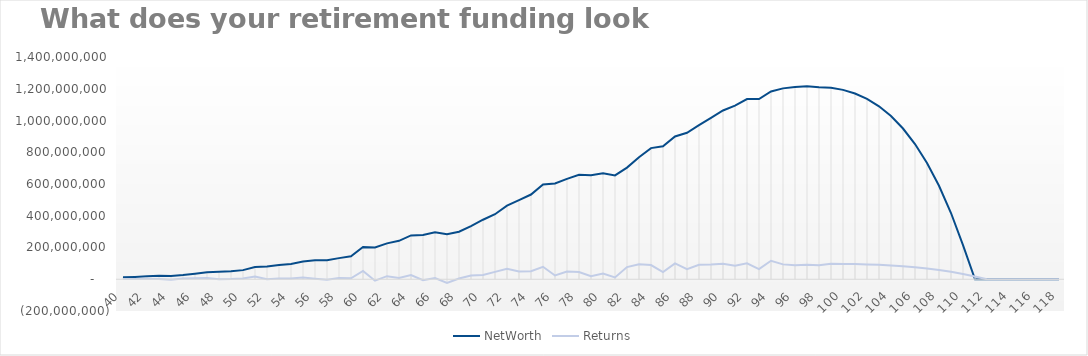
| Category | NetWorth | Returns |
|---|---|---|
| 40.0 | 12292444.778 | 1292444.778 |
| 41.0 | 14690159.456 | 1300964.678 |
| 42.0 | 18507638.558 | 2615334.101 |
| 43.0 | 21353087.016 | 1528527.234 |
| 44.0 | 19764624.223 | -3030338.404 |
| 45.0 | 26388182.312 | 5045687.392 |
| 46.0 | 34770624.664 | 6656602.448 |
| 47.0 | 44715309.616 | 8057891.716 |
| 48.0 | 46652780.916 | -124352.116 |
| 49.0 | 49924198.982 | 1019305.53 |
| 50.0 | 57491035.908 | 5107897.73 |
| 51.0 | 77573676.823 | 17398954.676 |
| 52.0 | 80613501.472 | 111975.583 |
| 53.0 | 89063178.374 | 5256632.277 |
| 54.0 | 96732942.314 | 4188742.837 |
| 55.0 | 111755054.916 | 11228444.234 |
| 56.0 | 118985739.576 | 3097655.411 |
| 57.0 | 119673400.049 | -3813651.202 |
| 58.0 | 133104890.391 | 8530588.542 |
| 59.0 | 144505180.305 | 6065911.8 |
| 60.0 | 202975840.463 | 52666133.464 |
| 61.0 | 199957846.358 | -9332351.727 |
| 62.0 | 226187794.207 | 19362825.15 |
| 63.0 | 241885226.57 | 8231097.829 |
| 64.0 | 276278037.352 | 26277023.656 |
| 65.0 | 278766139.898 | -6331475.494 |
| 66.0 | 296326536.077 | 7978263.852 |
| 67.0 | 282859324.357 | -23875439.999 |
| 68.0 | 299080115.174 | 4917765.598 |
| 69.0 | 334947379.706 | 23595171.122 |
| 70.0 | 374948115.566 | 26679289.535 |
| 71.0 | 409782925.843 | 46571893.273 |
| 72.0 | 463213558.44 | 66106682.232 |
| 73.0 | 498421759.64 | 48898334.805 |
| 74.0 | 533701012.476 | 50064597.131 |
| 75.0 | 596344118.969 | 78611278.331 |
| 76.0 | 602807954.617 | 23709461.233 |
| 77.0 | 632540691.595 | 48358012.609 |
| 78.0 | 658387244.076 | 45961850.164 |
| 79.0 | 655533572.491 | 18870849.912 |
| 80.0 | 667789874.181 | 35718784.906 |
| 81.0 | 654153877.437 | 11703485.13 |
| 82.0 | 703291783.484 | 76504546.471 |
| 83.0 | 768806236.337 | 95070424.511 |
| 84.0 | 826253788.236 | 89368001.289 |
| 85.0 | 837424661.175 | 45644958.281 |
| 86.0 | 899701322.833 | 99508673.827 |
| 87.0 | 922730944.407 | 63240194.716 |
| 88.0 | 970395987.807 | 91092462.393 |
| 89.0 | 1015918521.931 | 92424146.638 |
| 90.0 | 1062973303.943 | 97708523.526 |
| 91.0 | 1093926189.636 | 85658926.528 |
| 92.0 | 1135019417.447 | 100175751.914 |
| 93.0 | 1135553884.097 | 64343592.68 |
| 94.0 | 1183113212.001 | 116473184.017 |
| 95.0 | 1202356704.409 | 93670457.01 |
| 96.0 | 1210303574.574 | 88327991.935 |
| 97.0 | 1215117228.178 | 91625265.116 |
| 98.0 | 1209380440.694 | 88019752.948 |
| 99.0 | 1205838130.333 | 97714753.307 |
| 100.0 | 1192947552 | 96467050.427 |
| 101.0 | 1170277117.098 | 95435804.16 |
| 102.0 | 1136344548.28 | 93622169.368 |
| 103.0 | 1089492994.901 | 90907563.862 |
| 104.0 | 1027872587.872 | 87159439.592 |
| 105.0 | 949420160.552 | 82229807.03 |
| 106.0 | 851836960.298 | 75953612.844 |
| 107.0 | 732564158.975 | 68146956.824 |
| 108.0 | 588755952.896 | 58605132.718 |
| 109.0 | 417250023.226 | 47100476.232 |
| 110.0 | 214535106.71 | 33380001.858 |
| 111.0 | 0 | 17162808.537 |
| 112.0 | 0 | 0 |
| 113.0 | 0 | 0 |
| 114.0 | 0 | 0 |
| 115.0 | 0 | 0 |
| 116.0 | 0 | 0 |
| 117.0 | 0 | 0 |
| 118.0 | 0 | 0 |